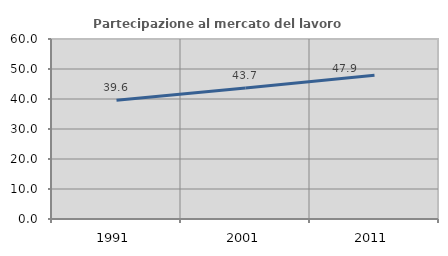
| Category | Partecipazione al mercato del lavoro  femminile |
|---|---|
| 1991.0 | 39.62 |
| 2001.0 | 43.674 |
| 2011.0 | 47.927 |